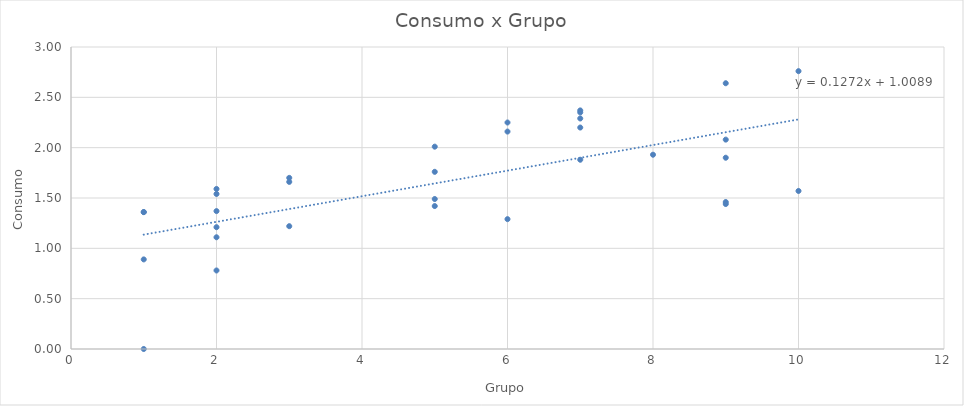
| Category | Y |
|---|---|
| 1.0 | 1.36 |
| 1.0 | 0 |
| 1.0 | 1.36 |
| 1.0 | 0.89 |
| 2.0 | 1.21 |
| 2.0 | 1.54 |
| 2.0 | 1.37 |
| 2.0 | 1.59 |
| 2.0 | 1.11 |
| 2.0 | 0.78 |
| 3.0 | 1.22 |
| 3.0 | 1.7 |
| 3.0 | 1.66 |
| 5.0 | 1.42 |
| 5.0 | 1.76 |
| 5.0 | 2.01 |
| 5.0 | 1.49 |
| 6.0 | 2.25 |
| 6.0 | 1.29 |
| 6.0 | 2.16 |
| 7.0 | 2.37 |
| 7.0 | 2.2 |
| 7.0 | 2.35 |
| 7.0 | 2.29 |
| 7.0 | 1.88 |
| 8.0 | 1.93 |
| 9.0 | 1.44 |
| 9.0 | 2.64 |
| 9.0 | 1.9 |
| 9.0 | 1.46 |
| 9.0 | 2.08 |
| 10.0 | 1.57 |
| 10.0 | 2.76 |